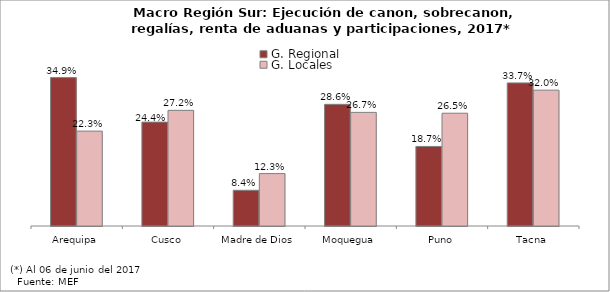
| Category | G. Regional | G. Locales |
|---|---|---|
| Arequipa | 0.349 | 0.223 |
| Cusco | 0.244 | 0.272 |
| Madre de Dios | 0.084 | 0.123 |
| Moquegua | 0.286 | 0.267 |
| Puno | 0.187 | 0.265 |
| Tacna | 0.337 | 0.32 |